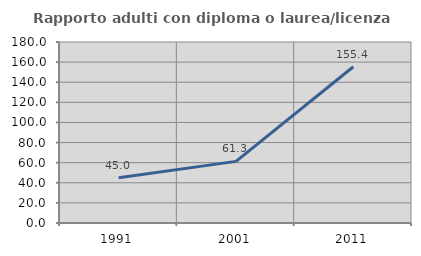
| Category | Rapporto adulti con diploma o laurea/licenza media  |
|---|---|
| 1991.0 | 45.029 |
| 2001.0 | 61.273 |
| 2011.0 | 155.367 |